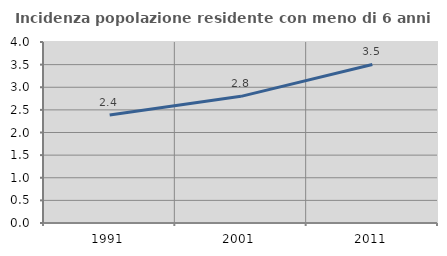
| Category | Incidenza popolazione residente con meno di 6 anni |
|---|---|
| 1991.0 | 2.386 |
| 2001.0 | 2.799 |
| 2011.0 | 3.504 |